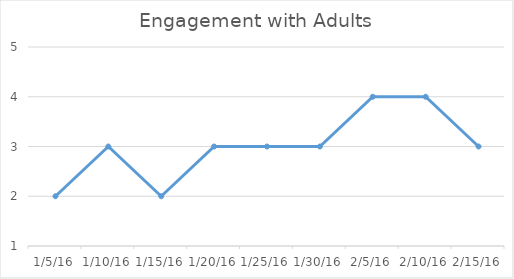
| Category | Series 0 |
|---|---|
| 1/5/16 | 2 |
| 1/10/16 | 3 |
| 1/15/16 | 2 |
| 1/20/16 | 3 |
| 1/25/16 | 3 |
| 1/30/16 | 3 |
| 2/5/16 | 4 |
| 2/10/16 | 4 |
| 2/15/16 | 3 |